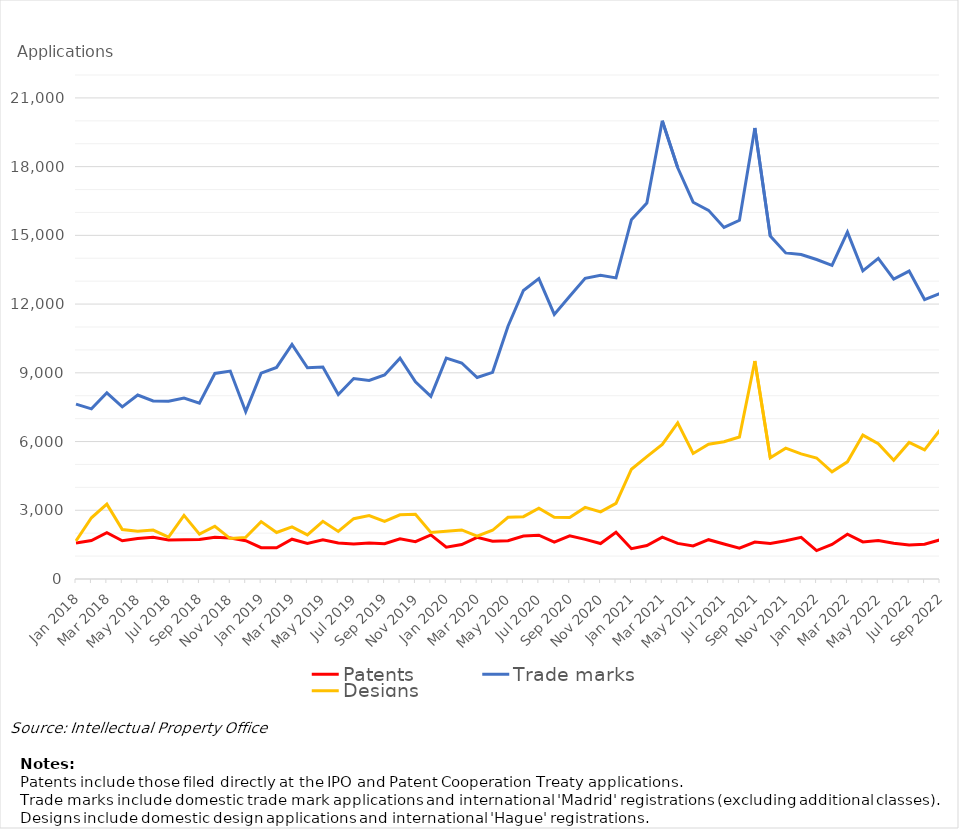
| Category | Patents | Trade marks | Designs |
|---|---|---|---|
| Jan 2018 | 1575 | 7634 | 1658 |
| Feb 2018 | 1676 | 7428 | 2672 |
| Mar 2018 | 2022 | 8127 | 3267 |
| Apr 2018 | 1670 | 7512 | 2160 |
| May 2018 | 1767 | 8030 | 2083 |
| Jun 2018 | 1821 | 7769 | 2136 |
| Jul 2018 | 1704 | 7757 | 1832 |
| Aug 2018 | 1713 | 7897 | 2777 |
| Sep 2018 | 1725 | 7673 | 1960 |
| Oct 2018 | 1818 | 8972 | 2302 |
| Nov 2018 | 1787 | 9076 | 1765 |
| Dec 2018 | 1670 | 7304 | 1815 |
| Jan 2019 | 1367 | 8985 | 2505 |
| Feb 2019 | 1361 | 9234 | 2031 |
| Mar 2019 | 1737 | 10243 | 2274 |
| Apr 2019 | 1552 | 9219 | 1923 |
| May 2019 | 1710 | 9251 | 2520 |
| Jun 2019 | 1569 | 8053 | 2074 |
| Jul 2019 | 1527 | 8752 | 2634 |
| Aug 2019 | 1571 | 8670 | 2768 |
| Sep 2019 | 1540 | 8907 | 2511 |
| Oct 2019 | 1755 | 9636 | 2800 |
| Nov 2019 | 1630 | 8607 | 2827 |
| Dec 2019 | 1926 | 7970 | 2028 |
| Jan 2020 | 1391 | 9642 | 2082 |
| Feb 2020 | 1504 | 9428 | 2143 |
| Mar 2020 | 1819 | 8794 | 1872 |
| Apr 2020 | 1648 | 9021 | 2127 |
| May 2020 | 1672 | 11035 | 2695 |
| Jun 2020 | 1879 | 12593 | 2721 |
| Jul 2020 | 1912 | 13110 | 3086 |
| Aug 2020 | 1614 | 11551 | 2695 |
| Sep 2020 | 1885 | 12340 | 2686 |
| Oct 2020 | 1730 | 13126 | 3124 |
| Nov 2020 | 1547 | 13254 | 2930 |
| Dec 2020 | 2042 | 13144 | 3302 |
| Jan 2021 | 1324 | 15685 | 4792 |
| Feb 2021 | 1462 | 16412 | 5340 |
| Mar 2021 | 1828 | 20001 | 5878 |
| Apr 2021 | 1554 | 17951 | 6815 |
| May 2021 | 1446 | 16446 | 5480 |
| Jun 2021 | 1716 | 16091 | 5881 |
| Jul 2021 | 1528 | 15345 | 5989 |
| Aug 2021 | 1344 | 15659 | 6200 |
| Sep 2021 | 1615 | 19685 | 9518 |
| Oct 2021 | 1547 | 14968 | 5292 |
| Nov 2021 | 1670 | 14233 | 5712 |
| Dec 2021 | 1818 | 14162 | 5464 |
| Jan 2022 | 1240 | 13945 | 5282 |
| Feb 2022 | 1507 | 13691 | 4679 |
| Mar 2022 | 1952 | 15141 | 5113 |
| Apr 2022 | 1617 | 13450 | 6282 |
| May 2022 | 1683 | 13992 | 5906 |
| Jun 2022 | 1559 | 13094 | 5184 |
| Jul 2022 | 1486 | 13440 | 5960 |
| Aug 2022 | 1520 | 12197 | 5639 |
| Sep 2022 | 1710 | 12468 | 6508 |